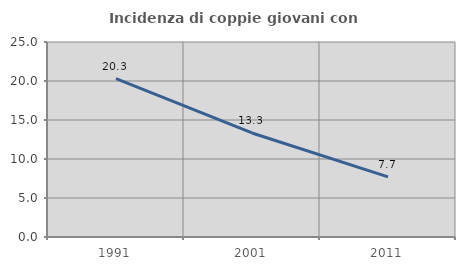
| Category | Incidenza di coppie giovani con figli |
|---|---|
| 1991.0 | 20.315 |
| 2001.0 | 13.336 |
| 2011.0 | 7.717 |